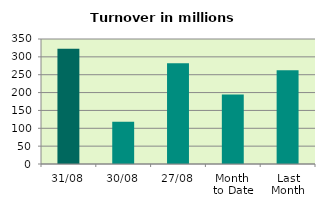
| Category | Series 0 |
|---|---|
| 31/08 | 322.723 |
| 30/08 | 118.583 |
| 27/08 | 282.121 |
| Month 
to Date | 194.848 |
| Last
Month | 262.308 |